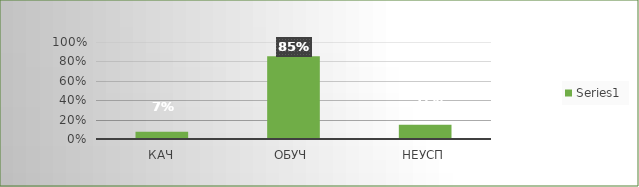
| Category | Series 0 |
|---|---|
| кач | 0.074 |
| обуч | 0.852 |
| неусп | 0.148 |